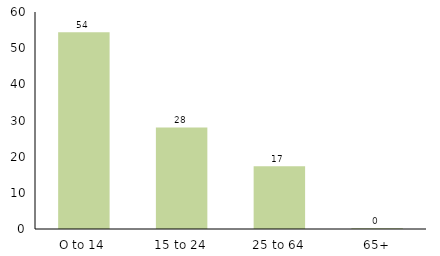
| Category | Series 0 |
|---|---|
| O to 14 | 54.419 |
| 15 to 24 | 28.073 |
| 25 to 64 | 17.335 |
| 65+ | 0.179 |